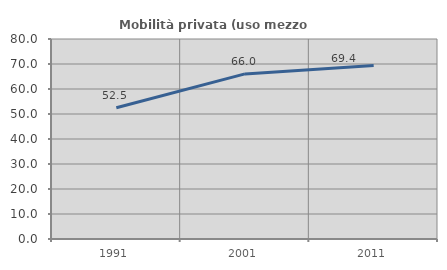
| Category | Mobilità privata (uso mezzo privato) |
|---|---|
| 1991.0 | 52.494 |
| 2001.0 | 66.04 |
| 2011.0 | 69.365 |